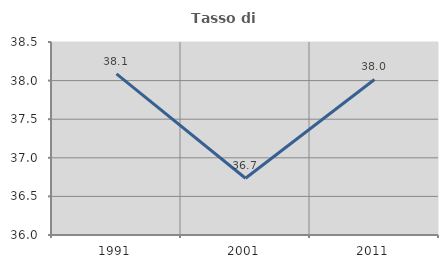
| Category | Tasso di occupazione   |
|---|---|
| 1991.0 | 38.088 |
| 2001.0 | 36.735 |
| 2011.0 | 38.015 |